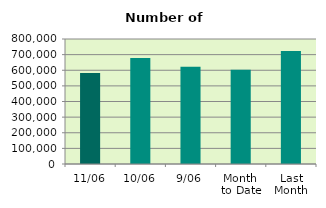
| Category | Series 0 |
|---|---|
| 11/06 | 582932 |
| 10/06 | 678430 |
| 9/06 | 622760 |
| Month 
to Date | 603780.889 |
| Last
Month | 723791.905 |